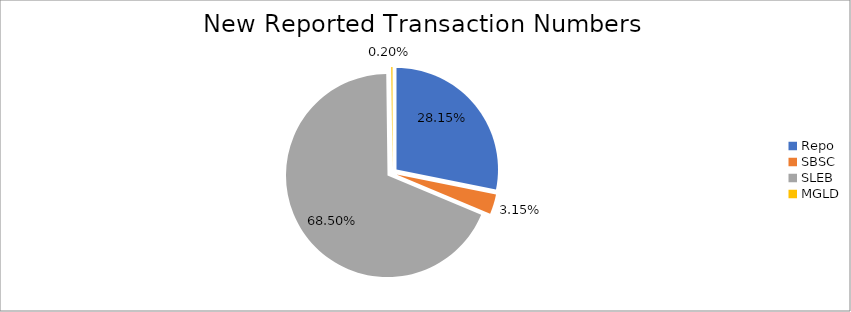
| Category | Series 0 |
|---|---|
| Repo | 376999 |
| SBSC | 42202 |
| SLEB | 917357 |
| MGLD | 2627 |